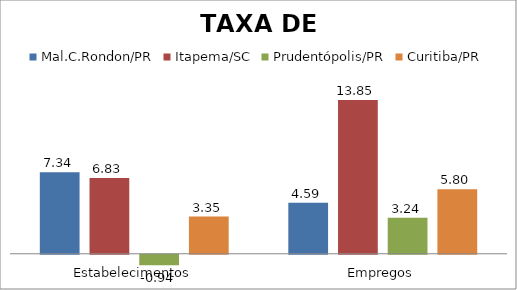
| Category | Mal.C.Rondon/PR | Itapema/SC | Prudentópolis/PR | Toledo/PR | Cascavel/PR | Curitiba/PR |
|---|---|---|---|---|---|---|
| Estabelecimentos | 7.34 | 6.83 | -0.94 |  |  | 3.35 |
| Empregos | 4.59 | 13.85 | 3.24 |  |  | 5.8 |